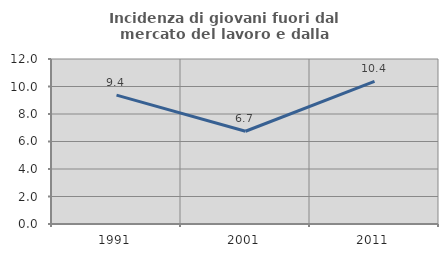
| Category | Incidenza di giovani fuori dal mercato del lavoro e dalla formazione  |
|---|---|
| 1991.0 | 9.375 |
| 2001.0 | 6.746 |
| 2011.0 | 10.373 |